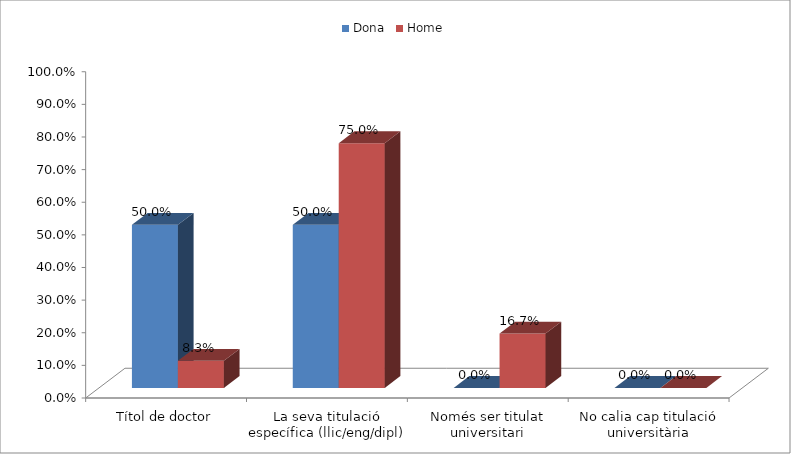
| Category | Dona | Home |
|---|---|---|
| Títol de doctor | 0.5 | 0.083 |
| La seva titulació específica (llic/eng/dipl) | 0.5 | 0.75 |
| Només ser titulat universitari | 0 | 0.167 |
| No calia cap titulació universitària | 0 | 0 |